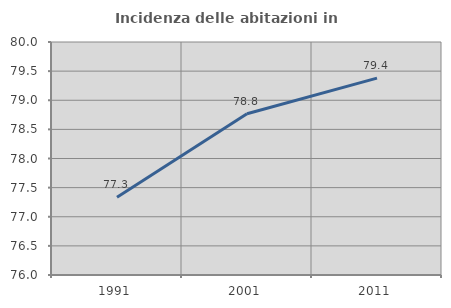
| Category | Incidenza delle abitazioni in proprietà  |
|---|---|
| 1991.0 | 77.333 |
| 2001.0 | 78.769 |
| 2011.0 | 79.38 |